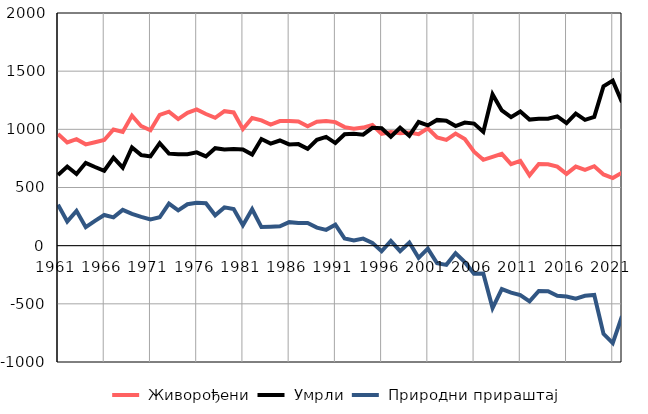
| Category |  Живорођени |  Умрли |  Природни прираштај |
|---|---|---|---|
| 1961.0 | 960 | 607 | 353 |
| 1962.0 | 888 | 680 | 208 |
| 1963.0 | 915 | 616 | 299 |
| 1964.0 | 871 | 712 | 159 |
| 1965.0 | 889 | 676 | 213 |
| 1966.0 | 908 | 644 | 264 |
| 1967.0 | 999 | 756 | 243 |
| 1968.0 | 978 | 670 | 308 |
| 1969.0 | 1118 | 845 | 273 |
| 1970.0 | 1027 | 779 | 248 |
| 1971.0 | 992 | 767 | 225 |
| 1972.0 | 1125 | 881 | 244 |
| 1973.0 | 1152 | 791 | 361 |
| 1974.0 | 1088 | 785 | 303 |
| 1975.0 | 1142 | 786 | 356 |
| 1976.0 | 1171 | 802 | 369 |
| 1977.0 | 1132 | 767 | 365 |
| 1978.0 | 1099 | 838 | 261 |
| 1979.0 | 1156 | 827 | 329 |
| 1980.0 | 1145 | 830 | 315 |
| 1981.0 | 1002 | 827 | 175 |
| 1982.0 | 1097 | 784 | 313 |
| 1983.0 | 1077 | 917 | 160 |
| 1984.0 | 1041 | 878 | 163 |
| 1985.0 | 1071 | 904 | 167 |
| 1986.0 | 1072 | 870 | 202 |
| 1987.0 | 1067 | 873 | 194 |
| 1988.0 | 1027 | 832 | 195 |
| 1989.0 | 1065 | 910 | 155 |
| 1990.0 | 1071 | 935 | 136 |
| 1991.0 | 1062 | 882 | 180 |
| 1992.0 | 1019 | 958 | 61 |
| 1993.0 | 1006 | 962 | 44 |
| 1994.0 | 1015 | 954 | 61 |
| 1995.0 | 1037 | 1013 | 24 |
| 1996.0 | 962 | 1010 | -48 |
| 1997.0 | 977 | 936 | 41 |
| 1998.0 | 966 | 1013 | -47 |
| 1999.0 | 972 | 945 | 27 |
| 2000.0 | 958 | 1063 | -105 |
| 2001.0 | 1009 | 1034 | -25 |
| 2002.0 | 930 | 1081 | -151 |
| 2003.0 | 909 | 1074 | -165 |
| 2004.0 | 963 | 1028 | -65 |
| 2005.0 | 916 | 1058 | -142 |
| 2006.0 | 808 | 1049 | -241 |
| 2007.0 | 738 | 978 | -240 |
| 2008.0 | 764 | 1300 | -536 |
| 2009.0 | 789 | 1162 | -373 |
| 2010.0 | 701 | 1105 | -404 |
| 2011.0 | 728 | 1153 | -425 |
| 2012.0 | 605 | 1084 | -479 |
| 2013.0 | 702 | 1091 | -389 |
| 2014.0 | 699 | 1091 | -392 |
| 2015.0 | 680 | 1111 | -431 |
| 2016.0 | 617 | 1054 | -437 |
| 2017.0 | 680 | 1135 | -455 |
| 2018.0 | 651 | 1082 | -431 |
| 2019.0 | 683 | 1107 | -424 |
| 2020.0 | 612 | 1370 | -758 |
| 2021.0 | 581 | 1419 | -838 |
| 2022.0 | 628 | 1234 | -606 |